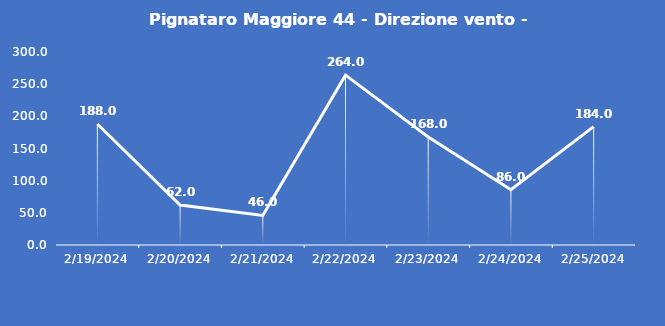
| Category | Pignataro Maggiore 44 - Direzione vento - Grezzo (°N) |
|---|---|
| 2/19/24 | 188 |
| 2/20/24 | 62 |
| 2/21/24 | 46 |
| 2/22/24 | 264 |
| 2/23/24 | 168 |
| 2/24/24 | 86 |
| 2/25/24 | 184 |